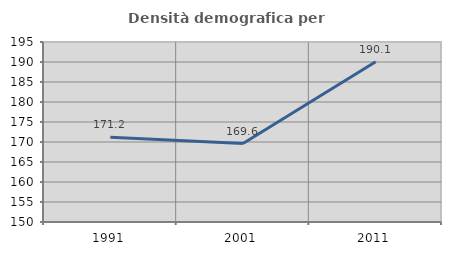
| Category | Densità demografica |
|---|---|
| 1991.0 | 171.2 |
| 2001.0 | 169.605 |
| 2011.0 | 190.054 |